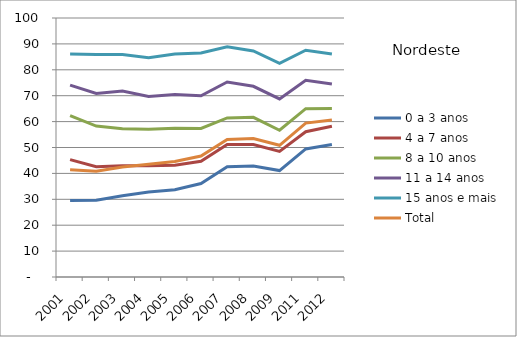
| Category | 0 a 3 anos | 4 a 7 anos | 8 a 10 anos | 11 a 14 anos | 15 anos e mais | Total |
|---|---|---|---|---|---|---|
| 2001.0 | 29.57 | 45.32 | 62.3 | 74.09 | 86.1 | 41.38 |
| 2002.0 | 29.67 | 42.58 | 58.29 | 70.83 | 85.9 | 40.86 |
| 2003.0 | 31.41 | 42.92 | 57.28 | 71.84 | 85.89 | 42.5 |
| 2004.0 | 32.84 | 42.98 | 57.06 | 69.66 | 84.66 | 43.54 |
| 2005.0 | 33.72 | 43.12 | 57.46 | 70.48 | 86.08 | 44.63 |
| 2006.0 | 36.1 | 44.69 | 57.37 | 69.99 | 86.5 | 46.7 |
| 2007.0 | 42.56 | 51.17 | 61.42 | 75.29 | 88.86 | 53.06 |
| 2008.0 | 42.85 | 51.13 | 61.64 | 73.63 | 87.28 | 53.5 |
| 2009.0 | 41.1 | 48.5 | 56.65 | 68.74 | 82.5 | 50.85 |
| 2011.0 | 49.46 | 56.09 | 64.99 | 75.93 | 87.56 | 59.41 |
| 2012.0 | 51.19 | 58.22 | 65.01 | 74.53 | 86.14 | 60.59 |